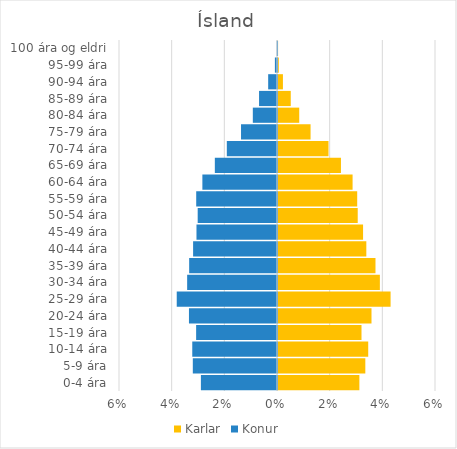
| Category | Karlar | Konur |
|---|---|---|
| 0-4 ára | 0.031 | -0.029 |
| 5-9 ára | 0.033 | -0.032 |
| 10-14 ára | 0.034 | -0.032 |
| 15-19 ára | 0.032 | -0.031 |
| 20-24 ára | 0.036 | -0.033 |
| 25-29 ára | 0.043 | -0.038 |
| 30-34 ára | 0.039 | -0.034 |
| 35-39 ára | 0.037 | -0.033 |
| 40-44 ára | 0.034 | -0.032 |
| 45-49 ára | 0.032 | -0.031 |
| 50-54 ára | 0.03 | -0.03 |
| 55-59 ára | 0.03 | -0.031 |
| 60-64 ára | 0.028 | -0.028 |
| 65-69 ára | 0.024 | -0.024 |
| 70-74 ára | 0.019 | -0.019 |
| 75-79 ára | 0.012 | -0.014 |
| 80-84 ára | 0.008 | -0.009 |
| 85-89 ára | 0.005 | -0.007 |
| 90-94 ára | 0.002 | -0.003 |
| 95-99 ára | 0 | -0.001 |
| 100 ára og eldri | 0 | 0 |